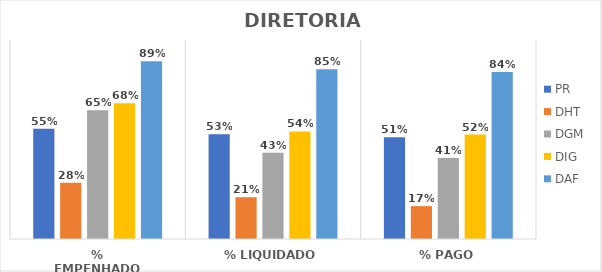
| Category | PR | DHT | DGM | DIG | DAF |
|---|---|---|---|---|---|
| % EMPENHADO | 0.554 | 0.283 | 0.647 | 0.682 | 0.894 |
| % LIQUIDADO | 0.527 | 0.21 | 0.434 | 0.541 | 0.853 |
| % PAGO | 0.511 | 0.165 | 0.406 | 0.525 | 0.839 |